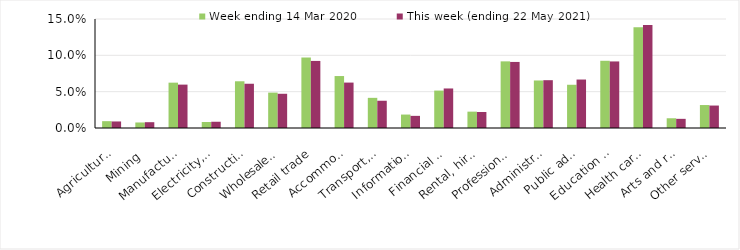
| Category | Week ending 14 Mar 2020 | This week (ending 22 May 2021) |
|---|---|---|
| Agriculture, forestry and fishing | 0.009 | 0.009 |
| Mining | 0.008 | 0.008 |
| Manufacturing | 0.062 | 0.06 |
| Electricity, gas, water and waste services | 0.008 | 0.009 |
| Construction | 0.064 | 0.061 |
| Wholesale trade | 0.049 | 0.047 |
| Retail trade | 0.097 | 0.092 |
| Accommodation and food services | 0.072 | 0.062 |
| Transport, postal and warehousing | 0.042 | 0.038 |
| Information media and telecommunications | 0.018 | 0.017 |
| Financial and insurance services | 0.052 | 0.054 |
| Rental, hiring and real estate services | 0.022 | 0.022 |
| Professional, scientific and technical services | 0.092 | 0.091 |
| Administrative and support services | 0.065 | 0.066 |
| Public administration and safety | 0.06 | 0.067 |
| Education and training | 0.092 | 0.092 |
| Health care and social assistance | 0.138 | 0.142 |
| Arts and recreation services | 0.013 | 0.013 |
| Other services | 0.032 | 0.031 |